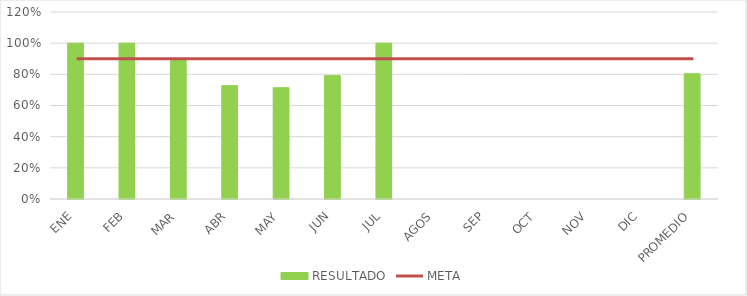
| Category | RESULTADO |
|---|---|
| 0 | 1 |
| 1 | 1 |
| 2 | 0.889 |
| 3 | 0.727 |
| 4 | 0.714 |
| 5 | 0.792 |
| 6 | 1 |
| 7 | 0 |
| 8 | 0 |
| 9 | 0 |
| 10 | 0 |
| 11 | 0 |
| 12 | 0.804 |